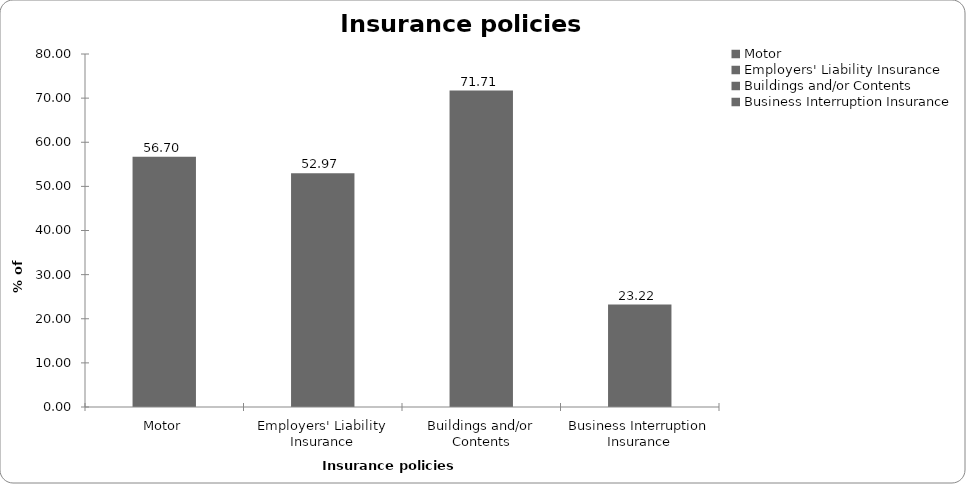
| Category | Series 0 |
|---|---|
| Motor | 56.704 |
| Employers' Liability Insurance | 52.969 |
| Buildings and/or Contents | 71.714 |
| Business Interruption Insurance | 23.215 |